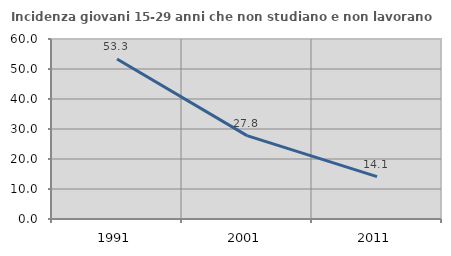
| Category | Incidenza giovani 15-29 anni che non studiano e non lavorano  |
|---|---|
| 1991.0 | 53.349 |
| 2001.0 | 27.778 |
| 2011.0 | 14.141 |